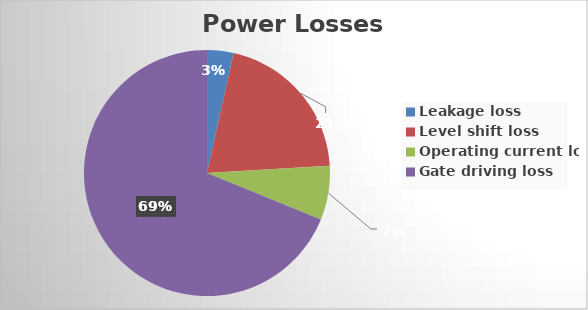
| Category | Series 0 |
|---|---|
| Leakage loss | 4.554 |
| Level shift loss | 26.91 |
| Operating current loss | 9.28 |
| Gate driving loss | 90 |